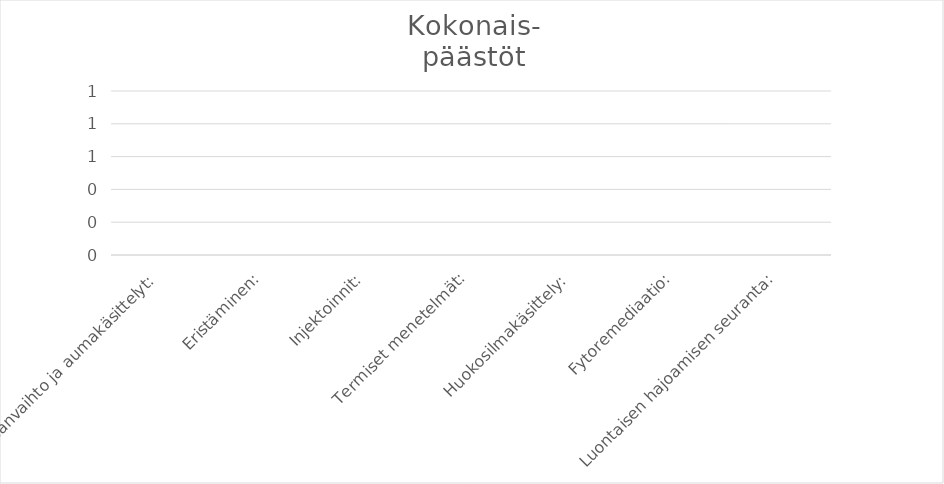
| Category | Kokonais-
päästöt |
|---|---|
| Massanvaihto ja aumakäsittelyt: | 0 |
| Eristäminen: | 0 |
| Injektoinnit: | 0 |
| Termiset menetelmät: | 0 |
| Huokosilmakäsittely: | 0 |
| Fytoremediaatio: | 0 |
| Luontaisen hajoamisen seuranta: | 0 |